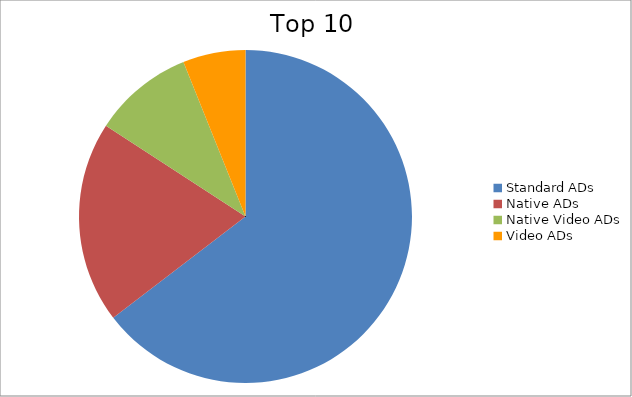
| Category | Series 0 |
|---|---|
| Standard ADs | 64.61 |
| Native ADs | 19.57 |
| Native Video ADs | 9.74 |
| Video ADs | 6.08 |